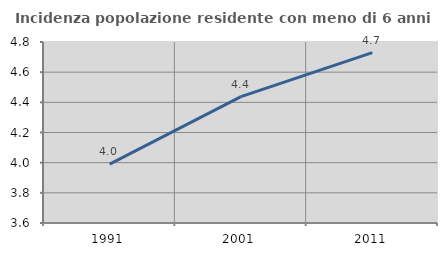
| Category | Incidenza popolazione residente con meno di 6 anni |
|---|---|
| 1991.0 | 3.99 |
| 2001.0 | 4.438 |
| 2011.0 | 4.73 |